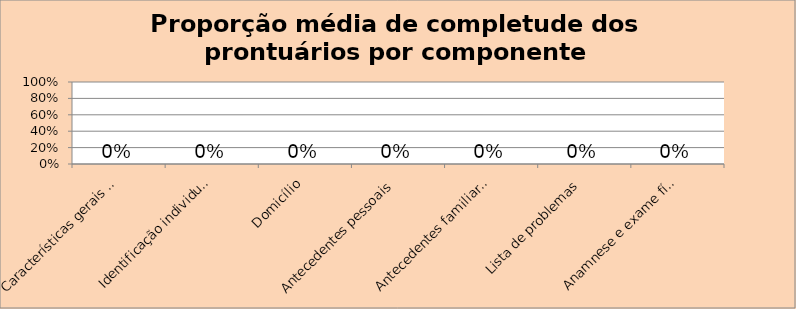
| Category | Series 0 |
|---|---|
| Características gerais do prontuário | 0 |
| Identificação individual | 0 |
| Domicílio | 0 |
| Antecedentes pessoais | 0 |
| Antecedentes familiares | 0 |
| Lista de problemas | 0 |
| Anamnese e exame físico | 0 |